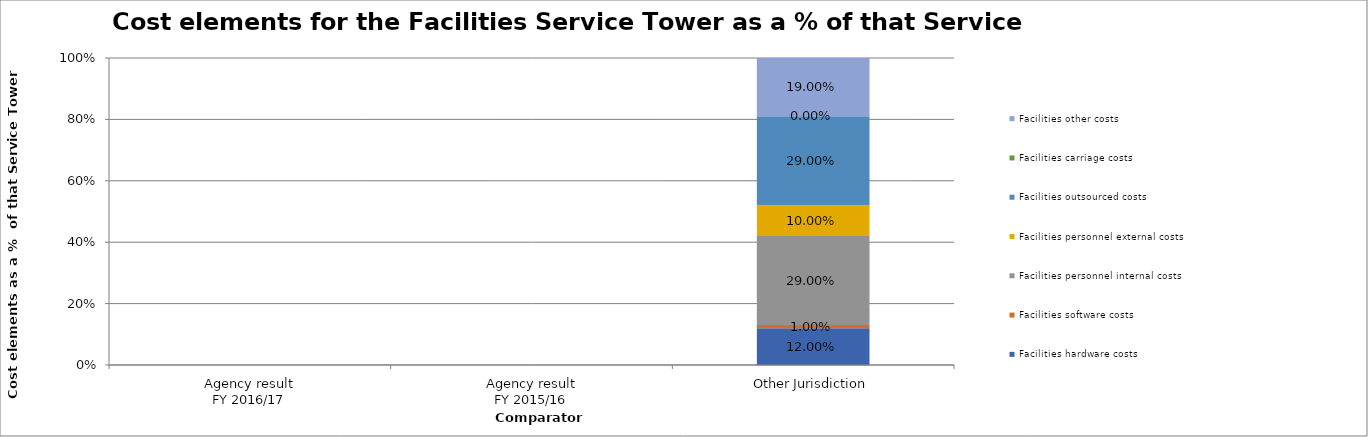
| Category | Facilities hardware costs | Facilities software costs | Facilities personnel internal costs | Facilities personnel external costs | Facilities outsourced costs | Facilities carriage costs | Facilities other costs |
|---|---|---|---|---|---|---|---|
| Agency result
FY 2016/17 | 0 | 0 | 0 | 0 | 0 | 0 | 0 |
| Agency result
FY 2015/16 | 0 | 0 | 0 | 0 | 0 | 0 | 0 |
| Other Jurisdiction | 0.12 | 0.01 | 0.29 | 0.1 | 0.29 | 0 | 0.19 |